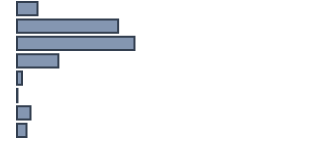
| Category | Series 0 |
|---|---|
| 0 | 6.629 |
| 1 | 32.73 |
| 2 | 38.018 |
| 3 | 13.394 |
| 4 | 1.658 |
| 5 | 0.152 |
| 6 | 4.36 |
| 7 | 3.059 |